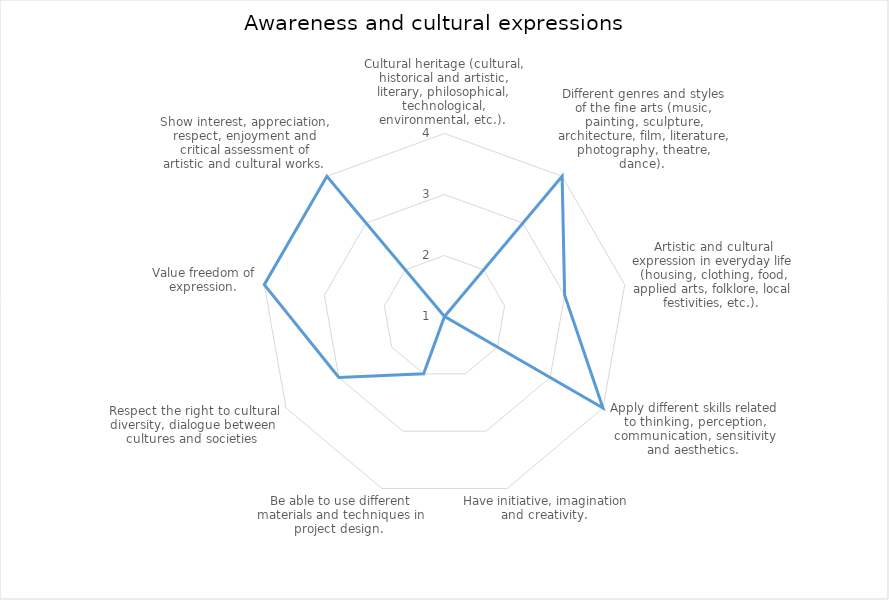
| Category | Series 0 |
|---|---|
| Cultural heritage (cultural, historical and artistic, literary, philosophical, technological, environmental, etc.).  | 1 |
| Different genres and styles of the fine arts (music, painting, sculpture, architecture, film, literature, photography, theatre, dance).  | 4 |
| Artistic and cultural expression in everyday life (housing, clothing, food, applied arts, folklore, local festivities, etc.).  | 3 |
| Apply different skills related to thinking, perception, communication, sensitivity and aesthetics.  | 4 |
| Have initiative, imagination and creativity.  | 1 |
| Be able to use different materials and techniques in project design.  | 2 |
| Respect the right to cultural diversity, dialogue between cultures and societies  | 3 |
| Value freedom of expression. | 4 |
| Show interest, appreciation, respect, enjoyment and critical assessment of artistic and cultural works.  | 4 |